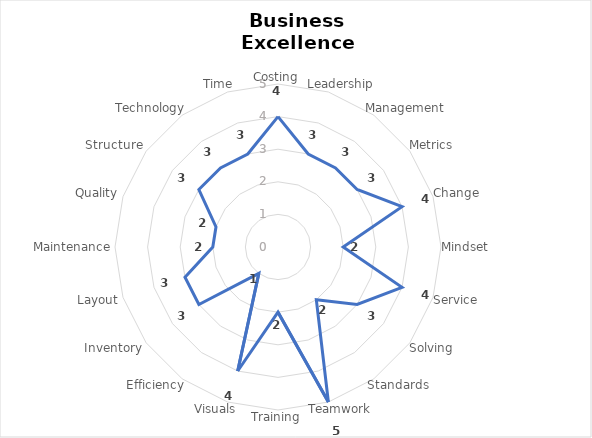
| Category | Series 0 |
|---|---|
| Costing | 4 |
| Leadership | 3 |
| Management | 3 |
| Metrics | 3 |
| Change | 4 |
| Mindset | 2 |
| Service  | 4 |
| Solving | 3 |
| Standards | 2 |
| Teamwork | 5 |
| Training | 2 |
| Visuals | 4 |
| Efficiency | 1 |
| Inventory | 3 |
| Layout | 3 |
| Maintenance | 2 |
| Quality | 2 |
| Structure | 3 |
| Technology | 3 |
| Time | 3 |